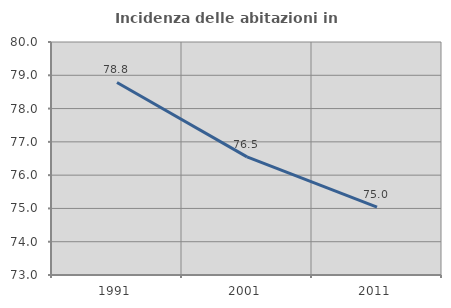
| Category | Incidenza delle abitazioni in proprietà  |
|---|---|
| 1991.0 | 78.784 |
| 2001.0 | 76.55 |
| 2011.0 | 75.037 |